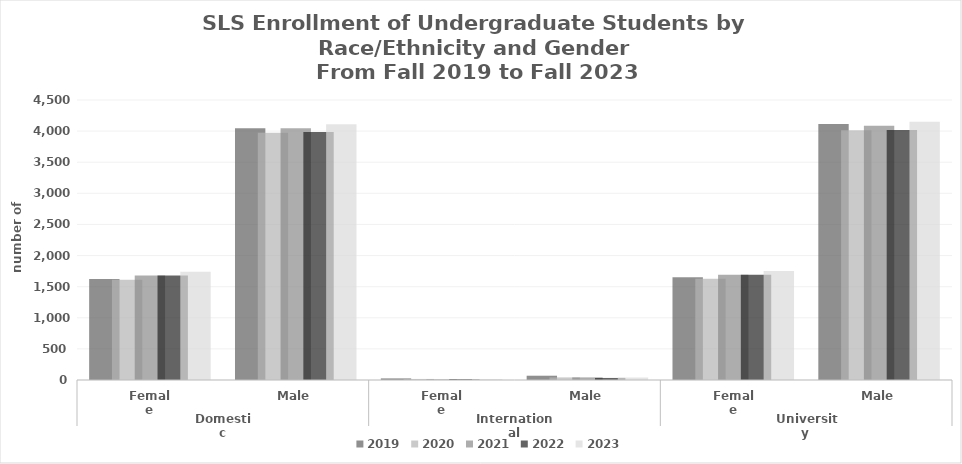
| Category | 2019  | 2020  | 2021  | 2022  | 2023  |
|---|---|---|---|---|---|
| 0 | 1624 | 1611 | 1680 | 1680 | 1739 |
| 1 | 4045 | 3972 | 4045 | 3984 | 4110 |
| 2 | 26 | 17 | 11 | 13 | 14 |
| 3 | 69 | 42 | 42 | 33 | 40 |
| 4 | 1650 | 1628 | 1691 | 1693 | 1753 |
| 5 | 4114 | 4014 | 4087 | 4017 | 4150 |